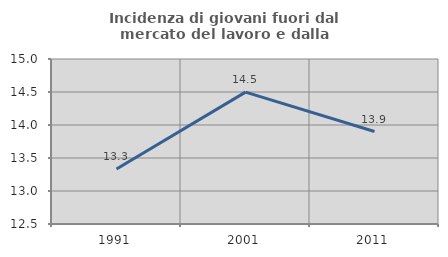
| Category | Incidenza di giovani fuori dal mercato del lavoro e dalla formazione  |
|---|---|
| 1991.0 | 13.333 |
| 2001.0 | 14.498 |
| 2011.0 | 13.901 |